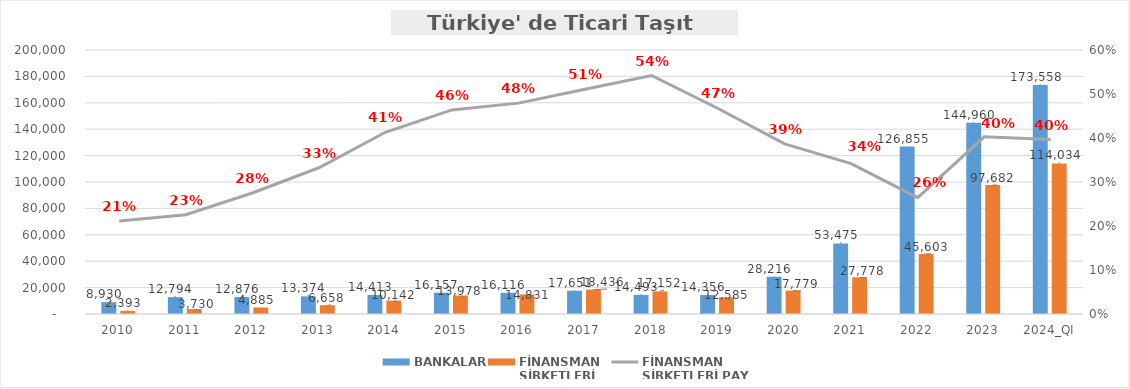
| Category | BANKALAR | FİNANSMAN 
ŞİRKETLERİ |
|---|---|---|
| 2010 | 8930.131 | 2392.721 |
| 2011 | 12793.723 | 3729.987 |
| 2012 | 12876.346 | 4885.495 |
| 2013 | 13374.424 | 6657.806 |
| 2014 | 14412.767 | 10141.887 |
| 2015 | 16157.225 | 13978.426 |
| 2016 | 16116.463 | 14831.249 |
| 2017 | 17650.963 | 18436.034 |
| 2018 | 14492.83 | 17152.034 |
| 2019 | 14355.978 | 12584.792 |
| 2020 | 28216.157 | 17779.072 |
| 2021 | 53475.488 | 27778.353 |
| 2022 | 126855.404 | 45602.871 |
| 2023 | 144959.787 | 97681.588 |
| 2024_QI | 173557.646 | 114033.764 |